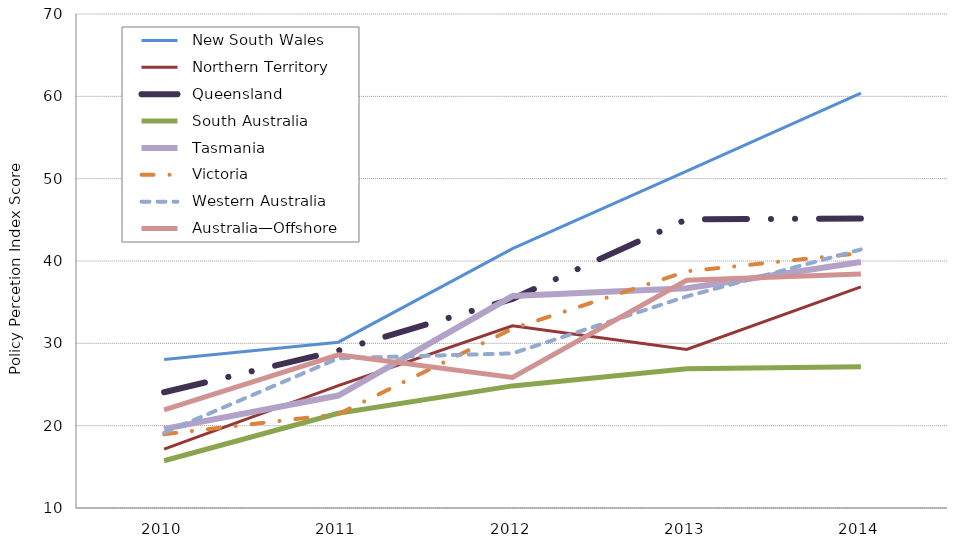
| Category |   New South Wales |   Northern Territory |   Queensland |   South Australia |   Tasmania |   Victoria |   Western Australia |   Australia—Offshore |
|---|---|---|---|---|---|---|---|---|
| 2010.0 | 28.05 | 17.14 | 24.06 | 15.74 | 19.61 | 18.96 | 19.13 | 21.93 |
| 2011.0 | 30.14 | 24.87 | 29.12 | 21.5 | 23.66 | 21.4 | 28.18 | 28.61 |
| 2012.0 | 41.5 | 32.12 | 35.4 | 24.83 | 35.74 | 31.78 | 28.78 | 25.86 |
| 2013.0 | 50.92 | 29.25 | 45.07 | 26.91 | 36.69 | 38.74 | 35.7 | 37.65 |
| 2014.0 | 60.38 | 36.85 | 45.15 | 27.17 | 39.88 | 40.96 | 41.4 | 38.41 |